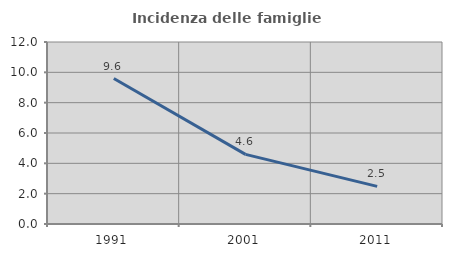
| Category | Incidenza delle famiglie numerose |
|---|---|
| 1991.0 | 9.59 |
| 2001.0 | 4.591 |
| 2011.0 | 2.483 |